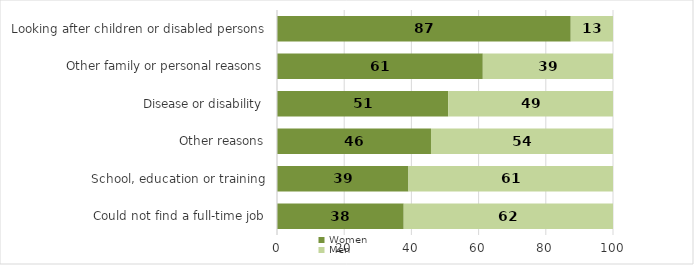
| Category | Women | Men |
|---|---|---|
| Could not find a full-time job | 37.711 | 62.289 |
| School, education or training | 39.119 | 60.881 |
| Other reasons | 45.831 | 54.169 |
| Disease or disability | 50.942 | 49.058 |
| Other family or personal reasons | 61.252 | 38.748 |
| Looking after children or disabled persons | 87.425 | 12.575 |